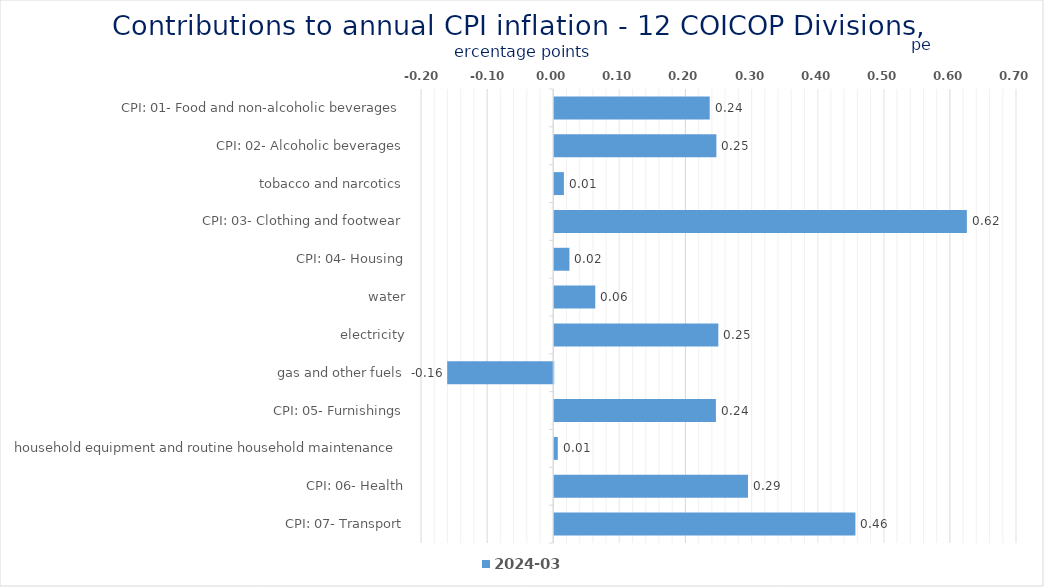
| Category | 2024-03 |
|---|---|
| CPI: 01- Food and non-alcoholic beverages | 0.235 |
| CPI: 02- Alcoholic beverages, tobacco and narcotics | 0.245 |
| CPI: 03- Clothing and footwear | 0.015 |
| CPI: 04- Housing, water, electricity, gas and other fuels | 0.624 |
| CPI: 05- Furnishings, household equipment and routine household maintenance | 0.023 |
| CPI: 06- Health | 0.062 |
| CPI: 07- Transport | 0.248 |
| CPI: 08- Communication | -0.16 |
| CPI: 09- Recreation and culture | 0.245 |
| CPI: 10- Education | 0.005 |
| CPI: 11- Restaurants and hotels | 0.293 |
| CPI: 12- Miscellaneous goods and services | 0.456 |